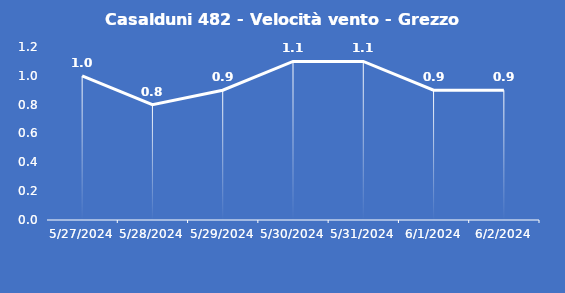
| Category | Casalduni 482 - Velocità vento - Grezzo (m/s) |
|---|---|
| 5/27/24 | 1 |
| 5/28/24 | 0.8 |
| 5/29/24 | 0.9 |
| 5/30/24 | 1.1 |
| 5/31/24 | 1.1 |
| 6/1/24 | 0.9 |
| 6/2/24 | 0.9 |